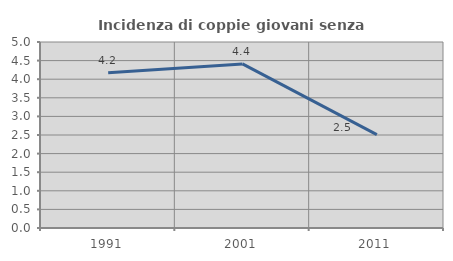
| Category | Incidenza di coppie giovani senza figli |
|---|---|
| 1991.0 | 4.17 |
| 2001.0 | 4.41 |
| 2011.0 | 2.511 |